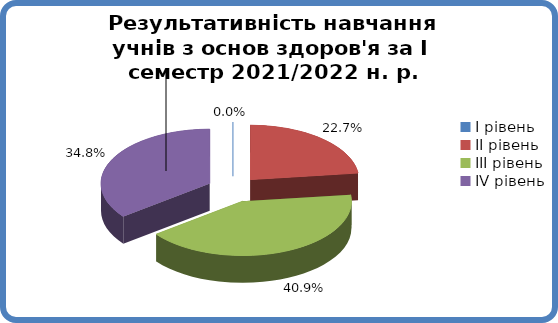
| Category | Series 0 |
|---|---|
| 0 | 0 |
| 1 | 0.227 |
| 2 | 0.409 |
| 3 | 0.348 |